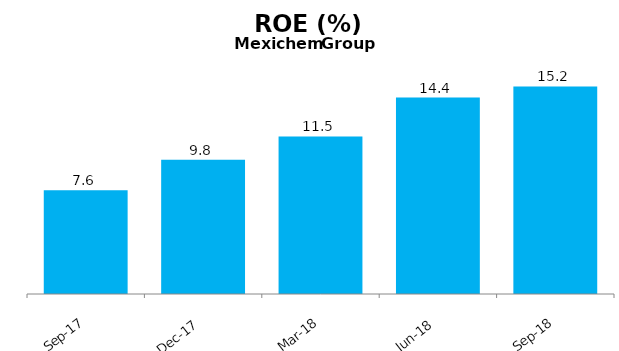
| Category | ROE (%) |
|---|---|
| 2017-09-01 | 7.575 |
| 2017-12-01 | 9.804 |
| 2018-03-01 | 11.515 |
| 2018-06-01 | 14.352 |
| 2018-09-01 | 15.169 |